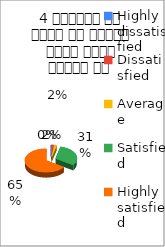
| Category | 4 शिक्षक ने विषय के प्रति रूचि रूचि जागृत की  |
|---|---|
| Highly dissatisfied | 0 |
| Dissatisfied | 1 |
| Average | 1 |
| Satisfied | 17 |
| Highly satisfied | 36 |